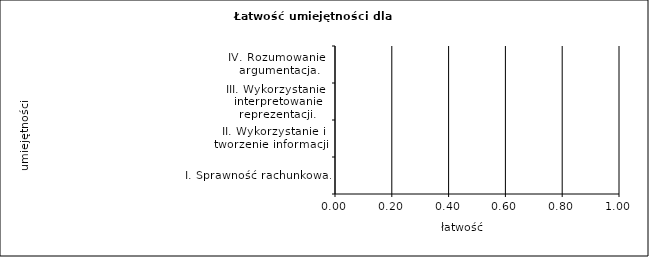
| Category | Łatwość według oddziałów |
|---|---|
| I. Sprawność rachunkowa. | 0 |
| II. Wykorzystanie i tworzenie informacji. | 0 |
| III. Wykorzystanie i interpretowanie reprezentacji. | 0 |
| IV. Rozumowanie i argumentacja. | 0 |